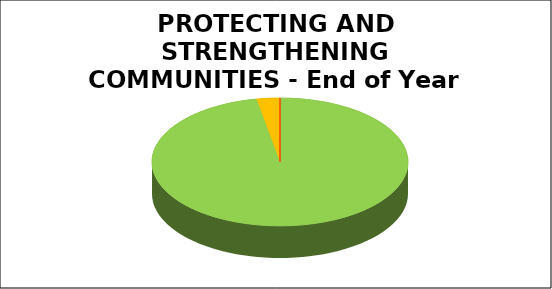
| Category | Series 0 |
|---|---|
| Green | 0.971 |
| Amber | 0.029 |
| Red | 0 |